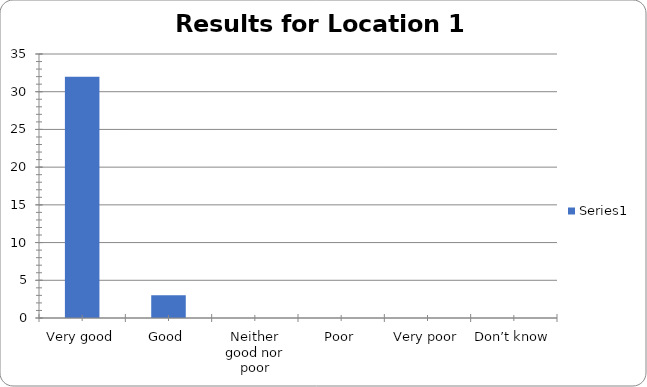
| Category | Series 0 |
|---|---|
| Very good | 32 |
| Good | 3 |
| Neither good nor poor | 0 |
| Poor | 0 |
| Very poor | 0 |
| Don’t know | 0 |